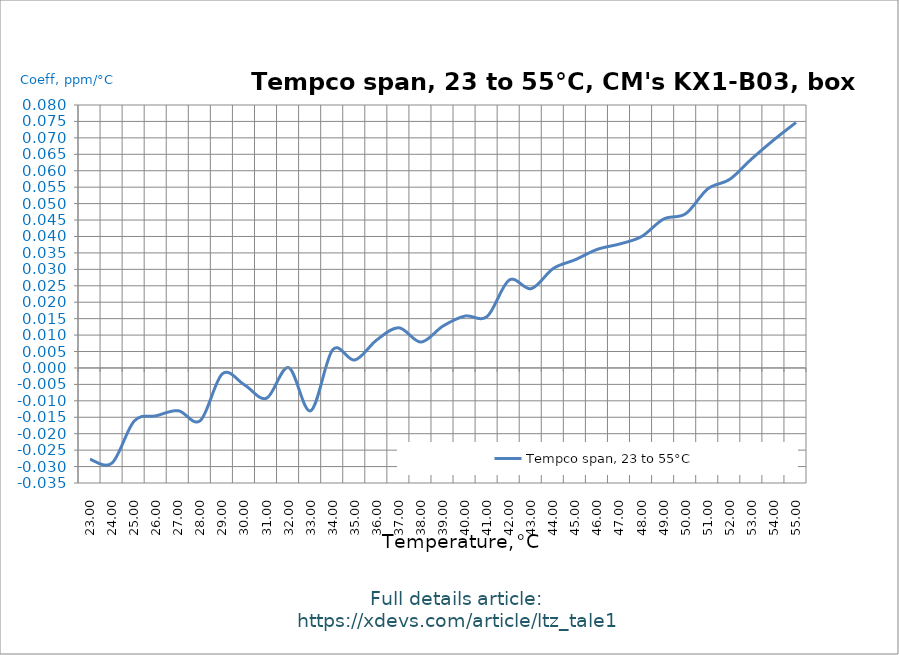
| Category | Tempco span, 23 to 55°C |
|---|---|
| 23.0 | -0.028 |
| 24.0 | -0.029 |
| 25.0 | -0.016 |
| 26.0 | -0.015 |
| 27.0 | -0.013 |
| 28.0 | -0.016 |
| 29.0 | -0.002 |
| 30.0 | -0.005 |
| 31.0 | -0.009 |
| 32.0 | 0 |
| 33.0 | -0.013 |
| 34.0 | 0.006 |
| 35.0 | 0.002 |
| 36.0 | 0.009 |
| 37.0 | 0.012 |
| 38.0 | 0.008 |
| 39.0 | 0.013 |
| 40.0 | 0.016 |
| 41.0 | 0.016 |
| 42.0 | 0.027 |
| 43.0 | 0.024 |
| 44.0 | 0.03 |
| 45.0 | 0.033 |
| 46.0 | 0.036 |
| 47.0 | 0.038 |
| 48.0 | 0.04 |
| 49.0 | 0.045 |
| 50.0 | 0.047 |
| 51.0 | 0.054 |
| 52.0 | 0.057 |
| 53.0 | 0.064 |
| 54.0 | 0.069 |
| 55.0 | 0.075 |